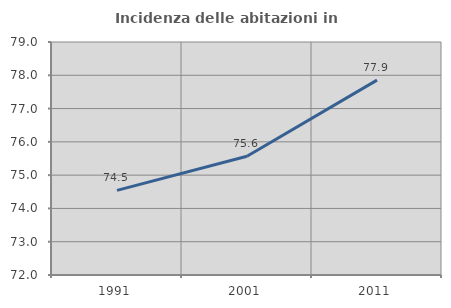
| Category | Incidenza delle abitazioni in proprietà  |
|---|---|
| 1991.0 | 74.544 |
| 2001.0 | 75.57 |
| 2011.0 | 77.854 |